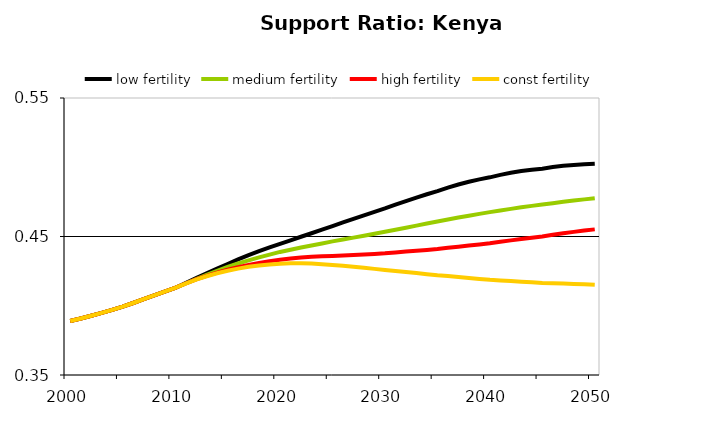
| Category | low fertility | medium fertility | high fertility | const fertility |
|---|---|---|---|---|
| 2000.0 | 0.389 | 0.389 | 0.389 | 0.389 |
| 2001.0 | 0.391 | 0.391 | 0.391 | 0.391 |
| 2002.0 | 0.393 | 0.393 | 0.393 | 0.393 |
| 2003.0 | 0.395 | 0.395 | 0.395 | 0.395 |
| 2004.0 | 0.397 | 0.397 | 0.397 | 0.397 |
| 2005.0 | 0.399 | 0.399 | 0.399 | 0.399 |
| 2006.0 | 0.402 | 0.402 | 0.402 | 0.402 |
| 2007.0 | 0.405 | 0.405 | 0.405 | 0.405 |
| 2008.0 | 0.407 | 0.407 | 0.407 | 0.407 |
| 2009.0 | 0.41 | 0.41 | 0.41 | 0.41 |
| 2010.0 | 0.413 | 0.413 | 0.413 | 0.413 |
| 2011.0 | 0.416 | 0.416 | 0.416 | 0.416 |
| 2012.0 | 0.42 | 0.419 | 0.419 | 0.419 |
| 2013.0 | 0.423 | 0.422 | 0.422 | 0.421 |
| 2014.0 | 0.427 | 0.425 | 0.424 | 0.423 |
| 2015.0 | 0.43 | 0.428 | 0.426 | 0.425 |
| 2016.0 | 0.433 | 0.431 | 0.428 | 0.427 |
| 2017.0 | 0.437 | 0.433 | 0.43 | 0.428 |
| 2018.0 | 0.439 | 0.435 | 0.431 | 0.429 |
| 2019.0 | 0.442 | 0.437 | 0.432 | 0.43 |
| 2020.0 | 0.445 | 0.439 | 0.433 | 0.43 |
| 2021.0 | 0.447 | 0.44 | 0.434 | 0.431 |
| 2022.0 | 0.45 | 0.442 | 0.435 | 0.431 |
| 2023.0 | 0.452 | 0.444 | 0.435 | 0.43 |
| 2024.0 | 0.455 | 0.445 | 0.436 | 0.43 |
| 2025.0 | 0.458 | 0.446 | 0.436 | 0.429 |
| 2026.0 | 0.46 | 0.448 | 0.436 | 0.429 |
| 2027.0 | 0.463 | 0.449 | 0.437 | 0.428 |
| 2028.0 | 0.465 | 0.451 | 0.437 | 0.427 |
| 2029.0 | 0.468 | 0.452 | 0.437 | 0.427 |
| 2030.0 | 0.47 | 0.453 | 0.438 | 0.426 |
| 2031.0 | 0.473 | 0.455 | 0.438 | 0.425 |
| 2032.0 | 0.476 | 0.456 | 0.439 | 0.424 |
| 2033.0 | 0.478 | 0.458 | 0.44 | 0.424 |
| 2034.0 | 0.481 | 0.459 | 0.44 | 0.423 |
| 2035.0 | 0.483 | 0.461 | 0.441 | 0.422 |
| 2036.0 | 0.485 | 0.462 | 0.442 | 0.421 |
| 2037.0 | 0.488 | 0.464 | 0.443 | 0.421 |
| 2038.0 | 0.49 | 0.465 | 0.443 | 0.42 |
| 2039.0 | 0.491 | 0.466 | 0.444 | 0.419 |
| 2040.0 | 0.493 | 0.468 | 0.445 | 0.419 |
| 2041.0 | 0.494 | 0.469 | 0.446 | 0.418 |
| 2042.0 | 0.496 | 0.47 | 0.447 | 0.418 |
| 2043.0 | 0.497 | 0.471 | 0.448 | 0.417 |
| 2044.0 | 0.498 | 0.472 | 0.449 | 0.417 |
| 2045.0 | 0.499 | 0.473 | 0.45 | 0.416 |
| 2046.0 | 0.5 | 0.474 | 0.451 | 0.416 |
| 2047.0 | 0.501 | 0.475 | 0.452 | 0.416 |
| 2048.0 | 0.502 | 0.476 | 0.453 | 0.416 |
| 2049.0 | 0.502 | 0.477 | 0.454 | 0.416 |
| 2050.0 | 0.502 | 0.478 | 0.455 | 0.415 |